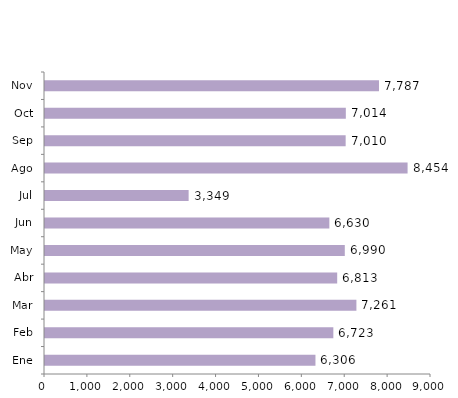
| Category | Series 0 |
|---|---|
| Ene | 6306 |
| Feb | 6723 |
| Mar | 7261 |
| Abr | 6813 |
| May | 6990 |
| Jun | 6630 |
| Jul | 3349 |
| Ago | 8454 |
| Sep | 7010 |
| Oct | 7014 |
| Nov | 7787 |